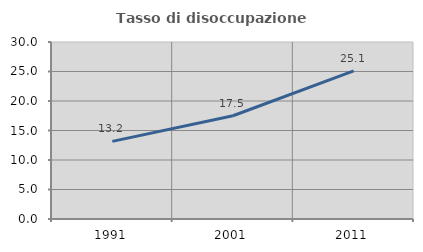
| Category | Tasso di disoccupazione giovanile  |
|---|---|
| 1991.0 | 13.151 |
| 2001.0 | 17.5 |
| 2011.0 | 25.1 |